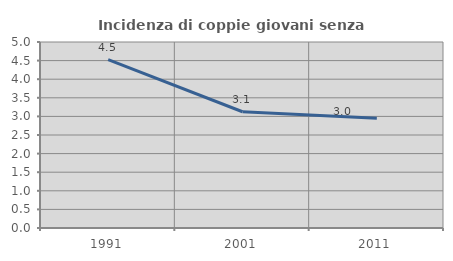
| Category | Incidenza di coppie giovani senza figli |
|---|---|
| 1991.0 | 4.524 |
| 2001.0 | 3.125 |
| 2011.0 | 2.952 |